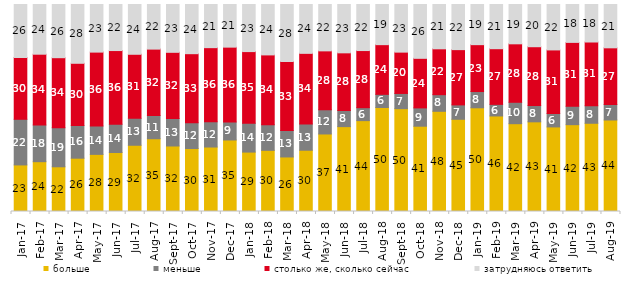
| Category | больше | меньше | столько же, сколько сейчас | затрудняюсь ответить |
|---|---|---|---|---|
| 2017-01-01 | 22.5 | 22.05 | 29.85 | 25.6 |
| 2017-02-01 | 24.05 | 17.7 | 34.2 | 24 |
| 2017-03-01 | 21.6 | 18.9 | 33.8 | 25.7 |
| 2017-04-01 | 25.75 | 15.8 | 30.05 | 28.4 |
| 2017-05-01 | 27.6 | 13.7 | 35.7 | 23 |
| 2017-06-01 | 28.5 | 13.65 | 35.6 | 22.25 |
| 2017-07-01 | 32 | 13 | 30.95 | 24.05 |
| 2017-08-01 | 35.15 | 11.2 | 32.1 | 21.55 |
| 2017-09-01 | 31.65 | 13.3 | 31.95 | 23.1 |
| 2017-10-01 | 30.4 | 12.45 | 33.35 | 23.75 |
| 2017-11-01 | 31.15 | 12.15 | 35.85 | 20.85 |
| 2017-12-01 | 34.55 | 8.7 | 36.15 | 20.6 |
| 2018-01-01 | 28.7 | 13.9 | 34.65 | 22.75 |
| 2018-02-01 | 29.55 | 12.4 | 33.7 | 24.35 |
| 2018-03-01 | 26.35 | 12.75 | 33.35 | 27.55 |
| 2018-04-01 | 29.6 | 12.7 | 34.1 | 23.6 |
| 2018-05-01 | 37.45 | 11.7 | 28.45 | 22.4 |
| 2018-06-01 | 41 | 7.8 | 27.85 | 23.35 |
| 2018-07-01 | 43.9 | 6.25 | 27.6 | 22.25 |
| 2018-08-01 | 50.25 | 6.35 | 24 | 19.4 |
| 2018-09-01 | 49.65 | 7.35 | 19.95 | 23 |
| 2018-10-01 | 41.2 | 8.85 | 23.95 | 26 |
| 2018-11-01 | 48.403 | 8.034 | 22.156 | 21.407 |
| 2018-12-01 | 44.55 | 6.95 | 26.7 | 21.8 |
| 2019-01-01 | 50.1 | 7.85 | 22.65 | 19.4 |
| 2019-02-01 | 46.15 | 5.6 | 26.9 | 21.35 |
| 2019-03-01 | 42.417 | 10.343 | 28.245 | 18.996 |
| 2019-04-01 | 43.317 | 7.871 | 28.416 | 20.396 |
| 2019-05-01 | 40.862 | 6.439 | 30.758 | 21.942 |
| 2019-06-01 | 41.945 | 8.878 | 30.873 | 18.304 |
| 2019-07-01 | 42.624 | 8.465 | 30.792 | 18.119 |
| 2019-08-01 | 44.206 | 7.493 | 27.373 | 20.929 |